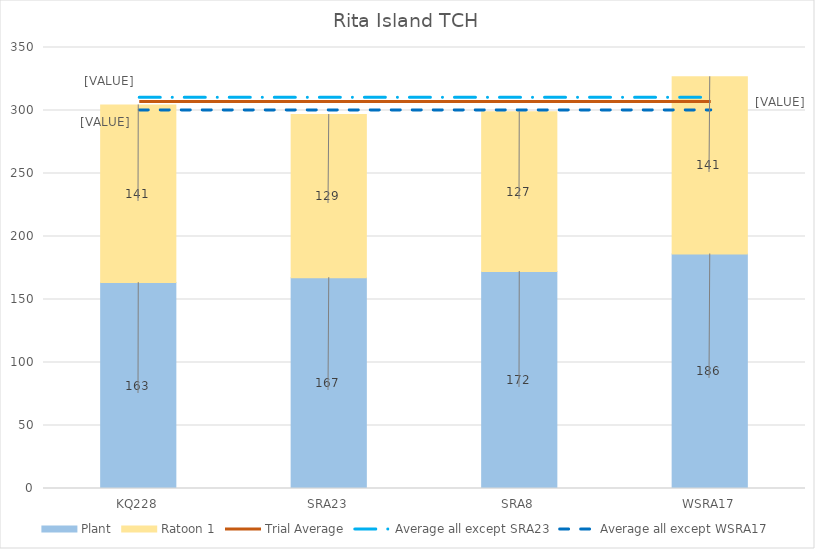
| Category | Plant | Ratoon 1 |
|---|---|---|
| KQ228 | 163.402 | 141.023 |
| SRA23 | 167.31 | 129.494 |
| SRA8 | 172.184 | 126.874 |
| WSRA17 | 186.115 | 140.644 |